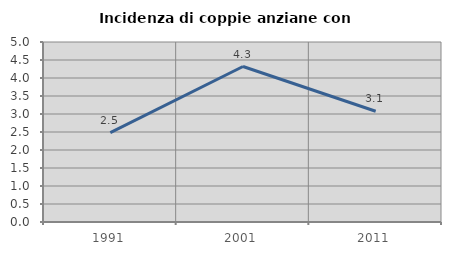
| Category | Incidenza di coppie anziane con figli |
|---|---|
| 1991.0 | 2.482 |
| 2001.0 | 4.319 |
| 2011.0 | 3.077 |